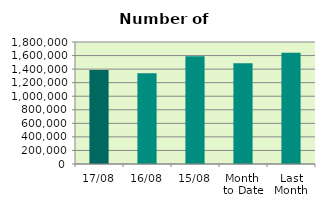
| Category | Series 0 |
|---|---|
| 17/08 | 1385416 |
| 16/08 | 1340038 |
| 15/08 | 1589612 |
| Month 
to Date | 1485452.154 |
| Last
Month | 1640369.455 |